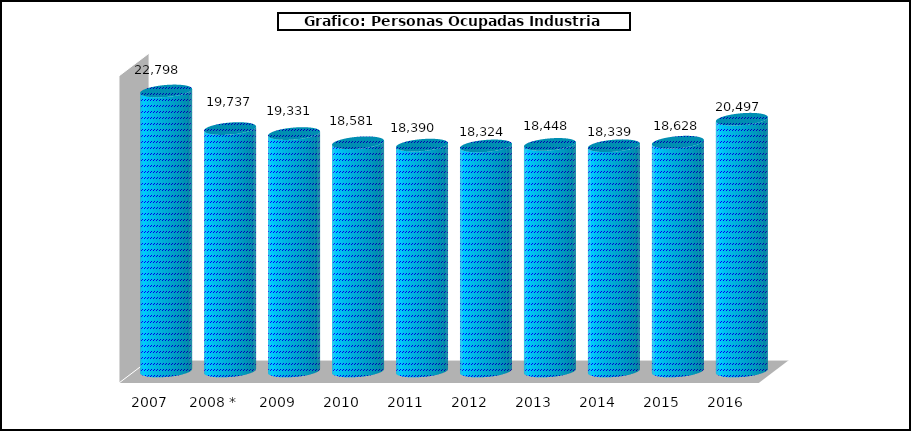
| Category |  Nº Personas Ocupadas Industria Pesquera |
|---|---|
| 2007 | 22798 |
| 2008 * | 19737 |
| 2009 | 19331 |
| 2010 | 18581 |
| 2011 | 18390 |
| 2012 | 18324 |
| 2013 | 18448 |
| 2014 | 18339 |
| 2015 | 18628 |
| 2016 | 20497 |